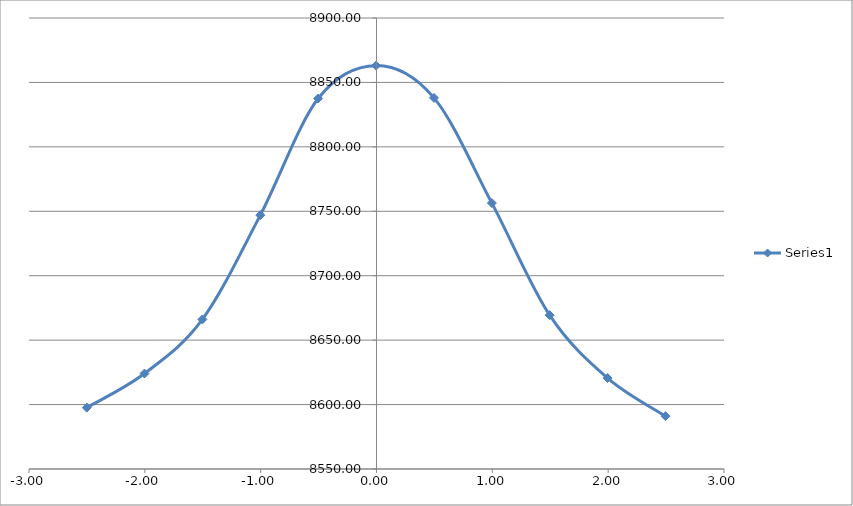
| Category | Series 0 |
|---|---|
| -2.5010000000000003 | 8597.635 |
| -2.003 | 8624.093 |
| -1.5030000000000001 | 8666.083 |
| -1.0030000000000001 | 8747.028 |
| -0.5040000000000004 | 8837.503 |
| -0.004000000000000448 | 8863.04 |
| 0.49599999999999955 | 8837.992 |
| 0.9959999999999996 | 8756.359 |
| 1.495 | 8669.389 |
| 1.995 | 8620.567 |
| 2.495 | 8591.032 |